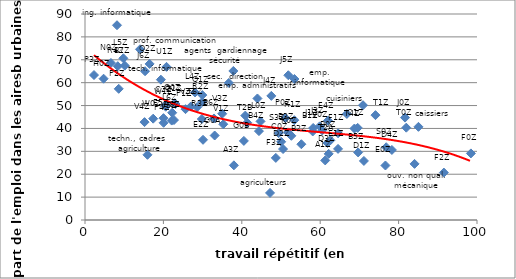
| Category | Series 0 |
|---|---|
| 47.205637380754446 | 11.824 |
| 61.277779640246806 | 26.028 |
| 15.933072346952123 | 28.481 |
| 37.98467837260379 | 23.885 |
| 62.59225109896103 | 34.807 |
| 58.098346319214045 | 38.675 |
| 55.191115877205554 | 33.106 |
| 51.80099042336911 | 38.261 |
| 44.37273589170909 | 38.832 |
| 69.6751039798256 | 29.518 |
| 32.906377312558696 | 44.364 |
| 10.14714838888241 | 67.451 |
| 50.05266421530319 | 34.18 |
| 69.56265881264596 | 40.243 |
| 20.600139205831997 | 50.237 |
| 84.07017747917176 | 24.518 |
| 71.15010754374174 | 25.807 |
| 50.52198571805296 | 31.001 |
| 62.16390857420547 | 28.903 |
| 78.2844863529746 | 30.602 |
| 22.698103079726025 | 43.674 |
| 76.64557977244971 | 23.817 |
| 64.55626965536811 | 31.062 |
| 30.113306613434975 | 35.034 |
| 98.44438168344479 | 29.089 |
| 64.56061150672261 | 37.879 |
| 91.54575583878675 | 20.713 |
| 48.68187944787898 | 27.128 |
| 61.98279535971069 | 43.422 |
| 20.018790577558498 | 44.497 |
| 33.082101474159444 | 36.911 |
| 40.528464819705846 | 34.559 |
| 23.087453150390225 | 50.686 |
| 4.7437780159958125 | 61.73 |
| 81.63757541045447 | 44.737 |
| 58.21283606108486 | 40.206 |
| 59.859195871193535 | 40.911 |
| 47.532263111553156 | 54.216 |
| 51.861576005134886 | 63.246 |
| 15.315474353347916 | 64.992 |
| 52.64433615430583 | 36.784 |
| 44.77646856969529 | 43.077 |
| 40.893052143541304 | 45.613 |
| 43.990768490866486 | 53.091 |
| 36.69149287071995 | 59.895 |
| 28.068200769935668 | 55.738 |
| 9.781780871960791 | 70.644 |
| 22.253443418617262 | 46.861 |
| 53.42706595899053 | 61.598 |
| 19.35917813734396 | 61.313 |
| 8.163172900040282 | 85.086 |
| 6.617868003574109 | 68.606 |
| 51.11424369367144 | 44.515 |
| 25.6466516309134 | 48.432 |
| 8.608516918480689 | 57.314 |
| 2.2953957923723003 | 63.331 |
| 20.051331124125582 | 42.466 |
| 22.90572051896773 | 51.024 |
| 29.92990200751745 | 54.583 |
| 16.48366607705134 | 68.194 |
| 85.06251083327686 | 40.704 |
| 53.39444243657139 | 43.602 |
| 29.8847600875349 | 51.592 |
| 29.80287555827012 | 44.113 |
| 8.361406673095422 | 67.194 |
| 76.84048354973385 | 31.788 |
| 66.80868623166697 | 46.332 |
| 70.92092950150624 | 50.147 |
| 49.3995304687314 | 37.93 |
| 81.9601757075573 | 40.331 |
| 74.09961391870384 | 45.816 |
| 61.86234633685858 | 33.63 |
| 41.37786019031227 | 42.528 |
| 37.83886507872226 | 65.109 |
| 68.73303161625857 | 39.963 |
| 28.606000443402166 | 49.302 |
| 14.034802547831449 | 74.59 |
| 20.797229245953062 | 66.912 |
| 60.51779696069647 | 39.122 |
| 35.278986299189064 | 41.837 |
| 26.98323169622799 | 49.556 |
| 35.009088676916726 | 46.415 |
| 15.188721794347131 | 42.764 |
| 22.120728630676258 | 43.438 |
| 17.39239657498961 | 44.269 |
| 20.59745534246829 | 49.482 |